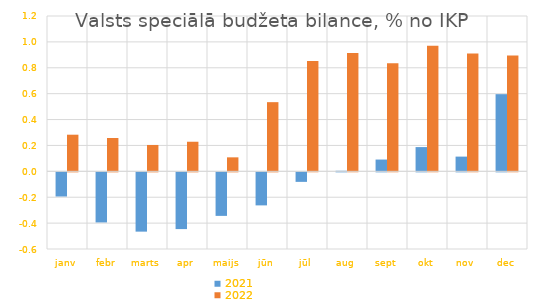
| Category | 2021 | 2022 |
|---|---|---|
| janv | -0.187 | 0.283 |
| febr | -0.387 | 0.257 |
| marts | -0.458 | 0.204 |
| apr | -0.438 | 0.229 |
| maijs | -0.336 | 0.108 |
| jūn | -0.255 | 0.534 |
| jūl | -0.074 | 0.852 |
| aug | 0.004 | 0.913 |
| sept | 0.091 | 0.834 |
| okt | 0.187 | 0.97 |
| nov | 0.114 | 0.911 |
| dec | 0.596 | 0.895 |